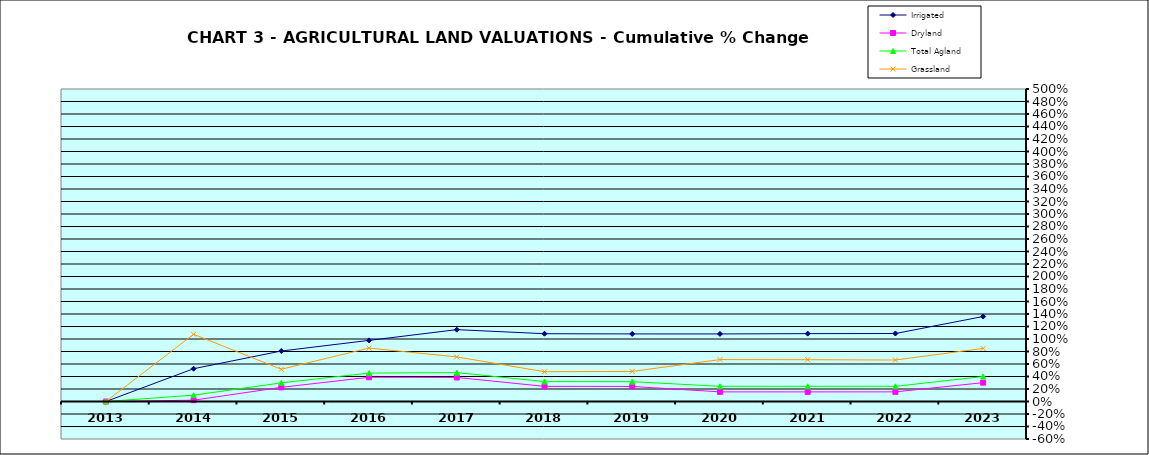
| Category | Irrigated | Dryland | Total Agland | Grassland |
|---|---|---|---|---|
| 2013.0 | 0 | 0 | 0 | 0 |
| 2014.0 | 0.525 | 0.021 | 0.101 | 1.075 |
| 2015.0 | 0.808 | 0.227 | 0.298 | 0.516 |
| 2016.0 | 0.978 | 0.388 | 0.455 | 0.855 |
| 2017.0 | 1.15 | 0.385 | 0.462 | 0.714 |
| 2018.0 | 1.085 | 0.242 | 0.318 | 0.476 |
| 2019.0 | 1.081 | 0.241 | 0.317 | 0.481 |
| 2020.0 | 1.081 | 0.154 | 0.243 | 0.67 |
| 2021.0 | 1.086 | 0.154 | 0.243 | 0.669 |
| 2022.0 | 1.088 | 0.154 | 0.243 | 0.664 |
| 2023.0 | 1.36 | 0.302 | 0.4 | 0.85 |